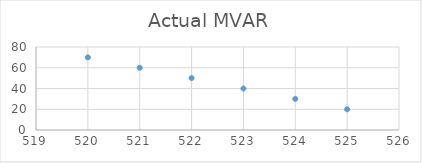
| Category | Actual MVAR |
|---|---|
| 525.0 | 20 |
| 524.0 | 30 |
| 523.0 | 40 |
| 522.0 | 50 |
| 521.0 | 60 |
| 520.0 | 70 |